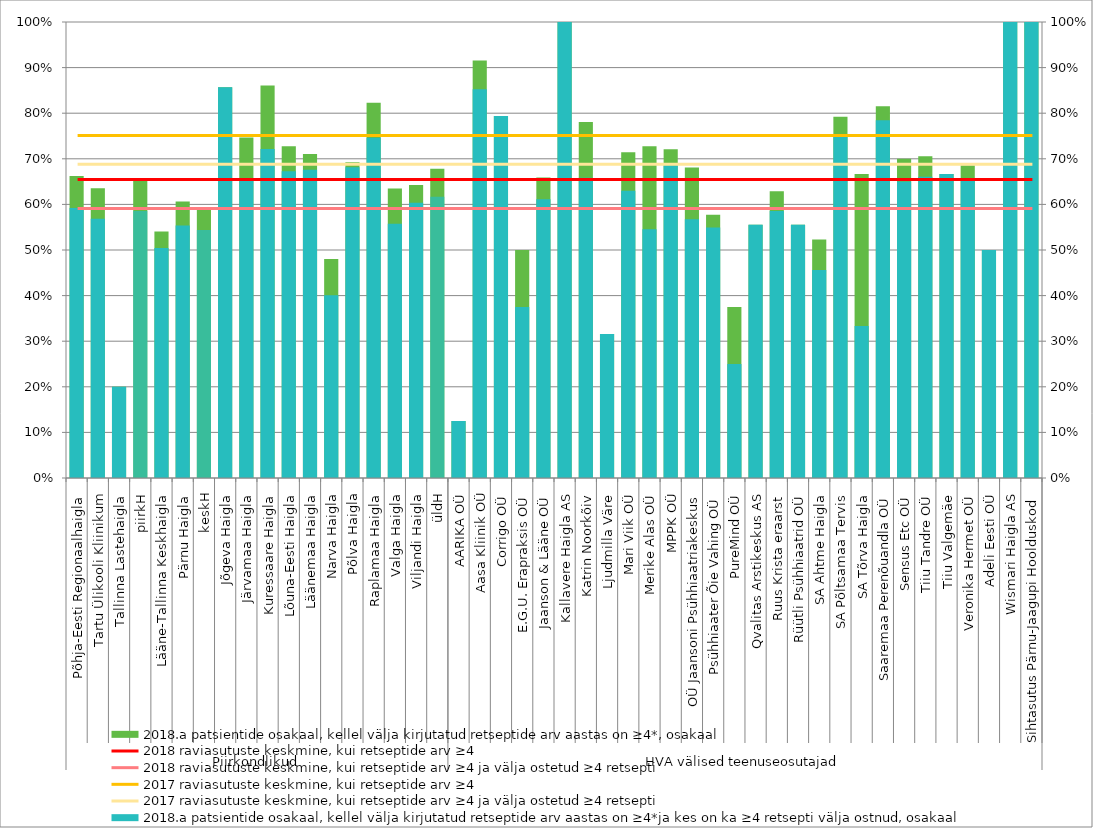
| Category | 2018.a patsientide osakaal, kellel välja kirjutatud retseptide arv aastas on ≥4*, osakaal |
|---|---|
| 0 | 0.662 |
| 1 | 0.636 |
| 2 | 0.2 |
| 3 | 0.655 |
| 4 | 0.541 |
| 5 | 0.606 |
| 6 | 0.593 |
| 7 | 0.857 |
| 8 | 0.747 |
| 9 | 0.861 |
| 10 | 0.727 |
| 11 | 0.71 |
| 12 | 0.48 |
| 13 | 0.692 |
| 14 | 0.823 |
| 15 | 0.635 |
| 16 | 0.642 |
| 17 | 0.678 |
| 18 | 0.125 |
| 19 | 0.916 |
| 20 | 0.794 |
| 21 | 0.5 |
| 22 | 0.659 |
| 23 | 1 |
| 24 | 0.78 |
| 25 | 0.316 |
| 26 | 0.714 |
| 27 | 0.727 |
| 28 | 0.721 |
| 29 | 0.681 |
| 30 | 0.577 |
| 31 | 0.375 |
| 32 | 0.556 |
| 33 | 0.629 |
| 34 | 0.556 |
| 35 | 0.523 |
| 36 | 0.792 |
| 37 | 0.667 |
| 38 | 0.815 |
| 39 | 0.7 |
| 40 | 0.705 |
| 41 | 0.667 |
| 42 | 0.686 |
| 43 | 0.5 |
| 44 | 1 |
| 45 | 1 |